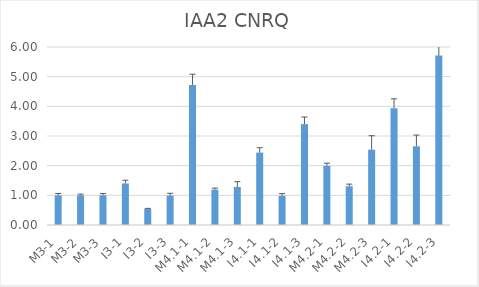
| Category | IAA2 CNRQ |
|---|---|
| M3-1 | 1 |
| M3-2 | 1 |
| M3-3 | 1 |
| I3-1 | 1.401 |
| I3-2 | 0.542 |
| I3-3 | 0.99 |
| M4.1-1 | 4.722 |
| M4.1-2 | 1.19 |
| M4.1-3 | 1.28 |
| I4.1-1 | 2.441 |
| I4.1-2 | 0.98 |
| I4.1-3 | 3.4 |
| M4.2-1 | 1.994 |
| M4.2-2 | 1.304 |
| M4.2-3 | 2.54 |
| I4.2-1 | 3.937 |
| I4.2-2 | 2.653 |
| I4.2-3 | 5.71 |